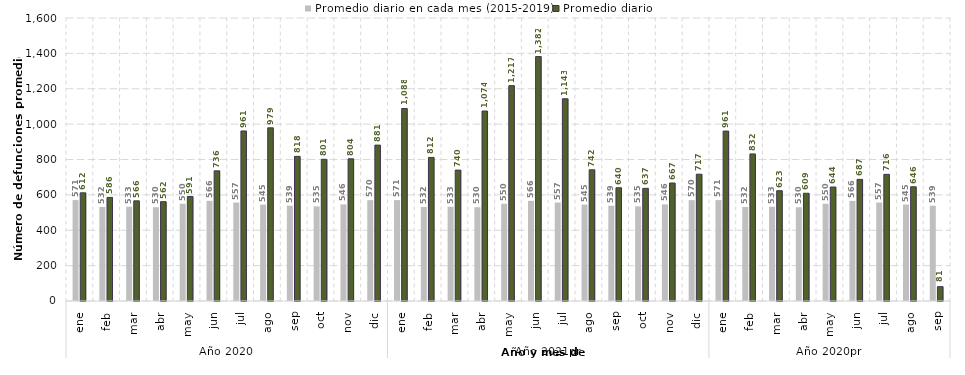
| Category | Promedio diario en cada mes (2015-2019) | Promedio diario |
|---|---|---|
| 0 | 570.51 | 611.645 |
| 1 | 531.722 | 585.552 |
| 2 | 532.877 | 566.29 |
| 3 | 530.26 | 561.533 |
| 4 | 549.858 | 590.581 |
| 5 | 566.267 | 735.7 |
| 6 | 556.568 | 961.355 |
| 7 | 545.026 | 979.032 |
| 8 | 538.867 | 817.7 |
| 9 | 535.013 | 801.065 |
| 10 | 546.253 | 803.967 |
| 11 | 570.265 | 881.355 |
| 12 | 570.51 | 1088.419 |
| 13 | 531.722 | 811.714 |
| 14 | 532.877 | 739.935 |
| 15 | 530.26 | 1073.967 |
| 16 | 549.858 | 1217.484 |
| 17 | 566.267 | 1381.933 |
| 18 | 556.568 | 1143.29 |
| 19 | 545.026 | 741.774 |
| 20 | 538.867 | 640.267 |
| 21 | 535.013 | 636.871 |
| 22 | 546.253 | 667.033 |
| 23 | 570.265 | 716.935 |
| 24 | 570.51 | 960.645 |
| 25 | 531.722 | 831.536 |
| 26 | 532.877 | 623.467 |
| 27 | 530.26 | 609.1 |
| 28 | 549.858 | 644.452 |
| 29 | 566.267 | 687.467 |
| 30 | 556.568 | 716 |
| 31 | 545.026 | 645.806 |
| 32 | 538.867 | 81.067 |